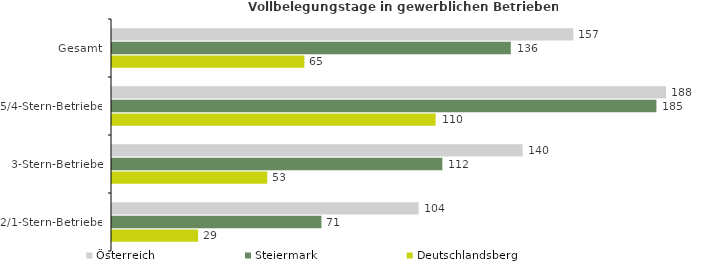
| Category | Österreich | Steiermark | Deutschlandsberg |
|---|---|---|---|
| Gesamt | 156.946 | 135.634 | 65.446 |
| 5/4-Stern-Betriebe | 188.443 | 185.178 | 110.066 |
| 3-Stern-Betriebe | 139.696 | 112.345 | 52.809 |
| 2/1-Stern-Betriebe | 104.286 | 71.229 | 29.3 |